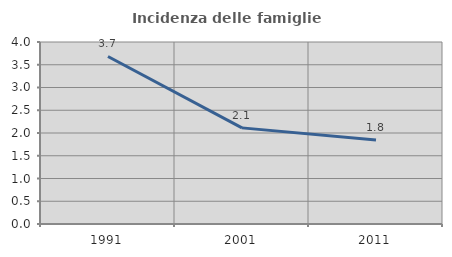
| Category | Incidenza delle famiglie numerose |
|---|---|
| 1991.0 | 3.682 |
| 2001.0 | 2.113 |
| 2011.0 | 1.846 |